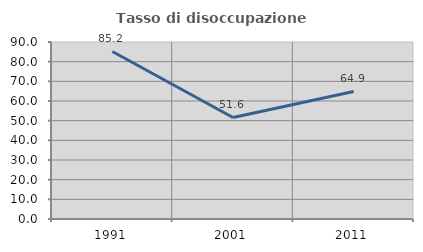
| Category | Tasso di disoccupazione giovanile  |
|---|---|
| 1991.0 | 85.185 |
| 2001.0 | 51.613 |
| 2011.0 | 64.865 |